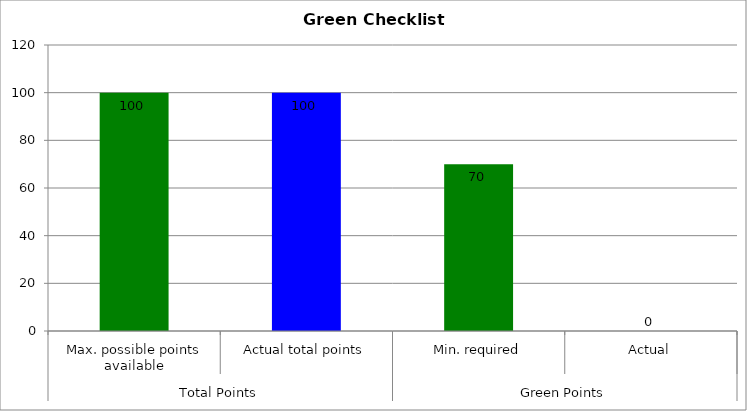
| Category | Series 0 |
|---|---|
| 0 | 100 |
| 1 | 100 |
| 2 | 70 |
| 3 | 0 |